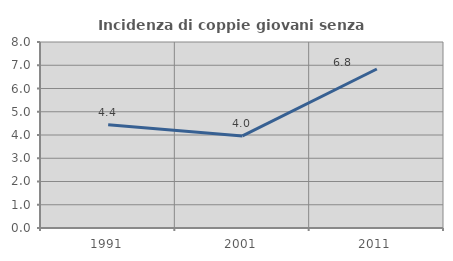
| Category | Incidenza di coppie giovani senza figli |
|---|---|
| 1991.0 | 4.444 |
| 2001.0 | 3.96 |
| 2011.0 | 6.838 |